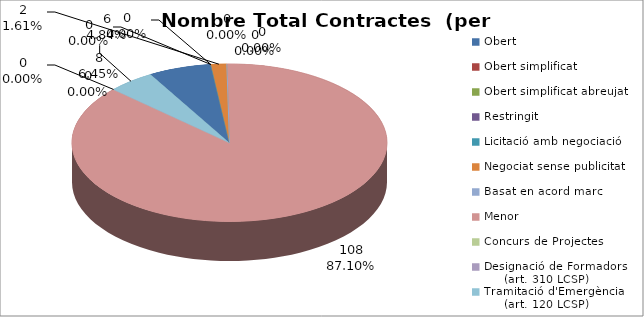
| Category | Nombre Total Contractes |
|---|---|
| Obert | 8 |
| Obert simplificat | 0 |
| Obert simplificat abreujat | 0 |
| Restringit | 0 |
| Licitació amb negociació | 0 |
| Negociat sense publicitat | 2 |
| Basat en acord marc | 0 |
| Menor | 108 |
| Concurs de Projectes | 0 |
| Designació de Formadors
     (art. 310 LCSP) | 0 |
| Tramitació d'Emergència
     (art. 120 LCSP) | 6 |